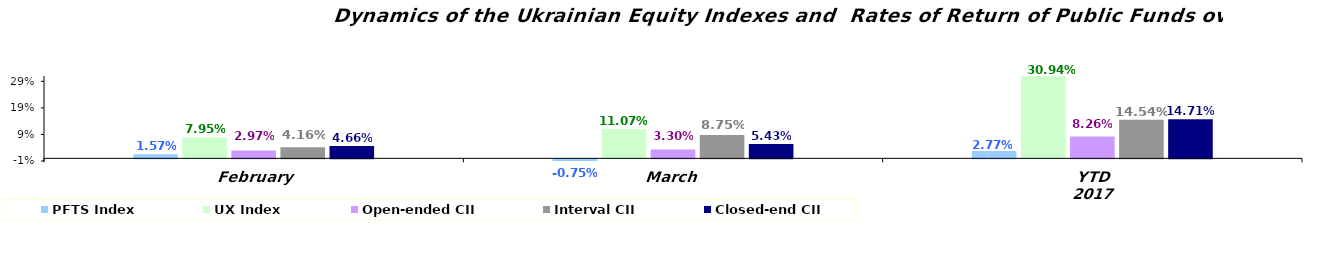
| Category | PFTS Index | UX Index | Open-ended CII | Interval CII | Closed-end CII |
|---|---|---|---|---|---|
| February | 0.016 | 0.08 | 0.03 | 0.042 | 0.047 |
| March | -0.008 | 0.111 | 0.033 | 0.087 | 0.054 |
| YTD 2017 | 0.028 | 0.309 | 0.083 | 0.145 | 0.147 |